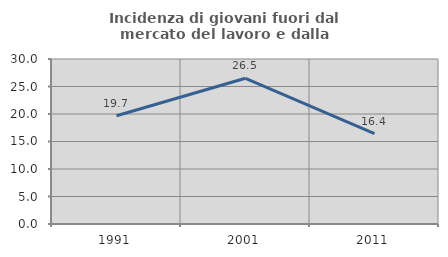
| Category | Incidenza di giovani fuori dal mercato del lavoro e dalla formazione  |
|---|---|
| 1991.0 | 19.693 |
| 2001.0 | 26.488 |
| 2011.0 | 16.412 |